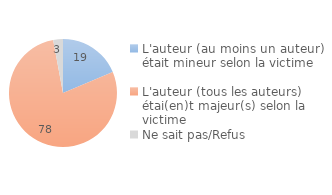
| Category | Series 0 |
|---|---|
| L'auteur (au moins un auteur) était mineur selon la victime | 18.658 |
| L'auteur (tous les auteurs) étai(en)t majeur(s) selon la victime | 78.425 |
| Ne sait pas/Refus | 2.917 |